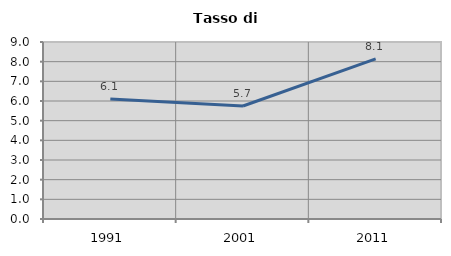
| Category | Tasso di disoccupazione   |
|---|---|
| 1991.0 | 6.104 |
| 2001.0 | 5.745 |
| 2011.0 | 8.144 |